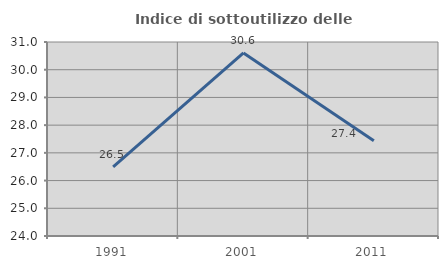
| Category | Indice di sottoutilizzo delle abitazioni  |
|---|---|
| 1991.0 | 26.49 |
| 2001.0 | 30.604 |
| 2011.0 | 27.434 |